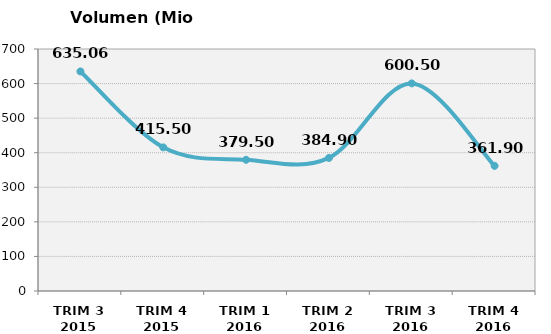
| Category | Volumen (Mio consumiciones) |
|---|---|
| TRIM 3 2015 | 635.065 |
| TRIM 4 2015 | 415.495 |
| TRIM 1 2016 | 379.5 |
| TRIM 2 2016 | 384.9 |
| TRIM 3 2016 | 600.5 |
| TRIM 4 2016 | 361.9 |